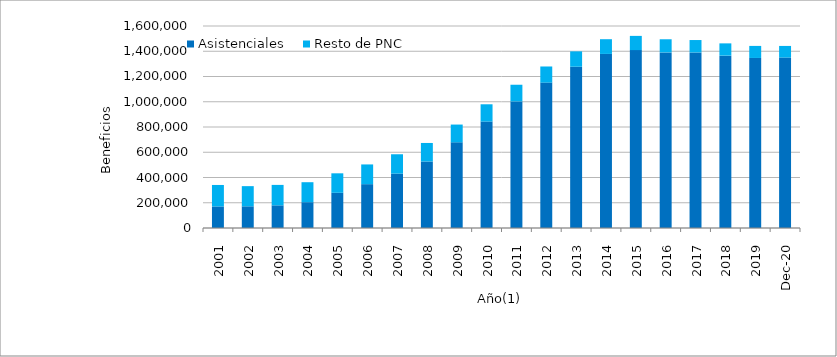
| Category | Asistenciales | Resto de PNC |
|---|---|---|
| 2001.0 | 170688 | 170159 |
| 2002.0 | 171790 | 159761 |
| 2003.0 | 179462 | 161912 |
| 2004.0 | 204383 | 158322 |
| 2005.0 | 278885 | 154252 |
| 2006.0 | 347223 | 156271 |
| 2007.0 | 430747 | 153352 |
| 2008.0 | 526978 | 146565 |
| 2009.0 | 678684 | 140652 |
| 2010.0 | 843222 | 136730 |
| 2011.0 | 1002631 | 132117 |
| 2012.0 | 1151713 | 127630 |
| 2013.0 | 1277482 | 121704 |
| 2014.0 | 1378747 | 116623 |
| 2015.0 | 1409012 | 112673 |
| 2016.0 | 1390872 | 104039 |
| 2017.0 | 1390560 | 98299 |
| 2018.0 | 1365207 | 97199 |
| 2019.0 | 1346815 | 95436 |
| 44166.0 | 1350178 | 91927 |